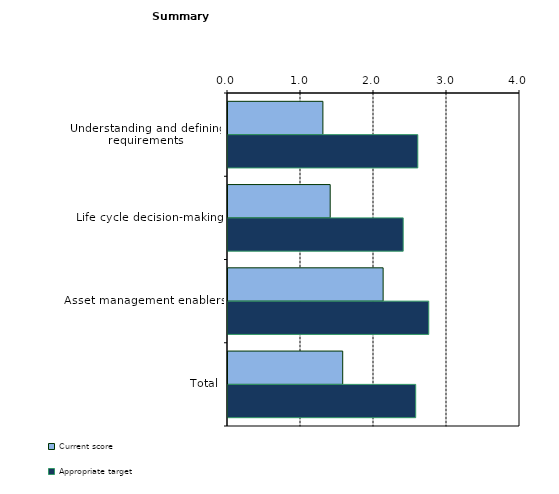
| Category | Current score | Appropriate target |
|---|---|---|
| Understanding and defining requirements | 1.3 | 2.6 |
| Life cycle decision-making | 1.4 | 2.4 |
| Asset management enablers | 2.125 | 2.75 |
| Total | 1.571 | 2.571 |